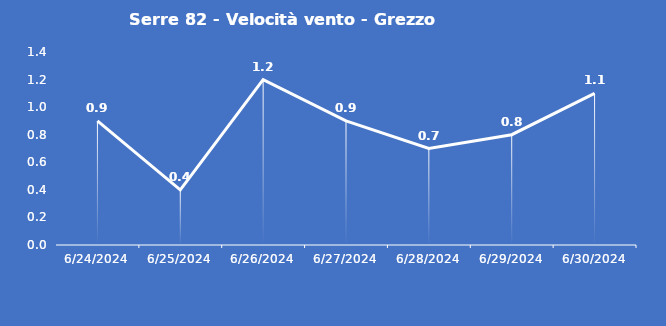
| Category | Serre 82 - Velocità vento - Grezzo (m/s) |
|---|---|
| 6/24/24 | 0.9 |
| 6/25/24 | 0.4 |
| 6/26/24 | 1.2 |
| 6/27/24 | 0.9 |
| 6/28/24 | 0.7 |
| 6/29/24 | 0.8 |
| 6/30/24 | 1.1 |